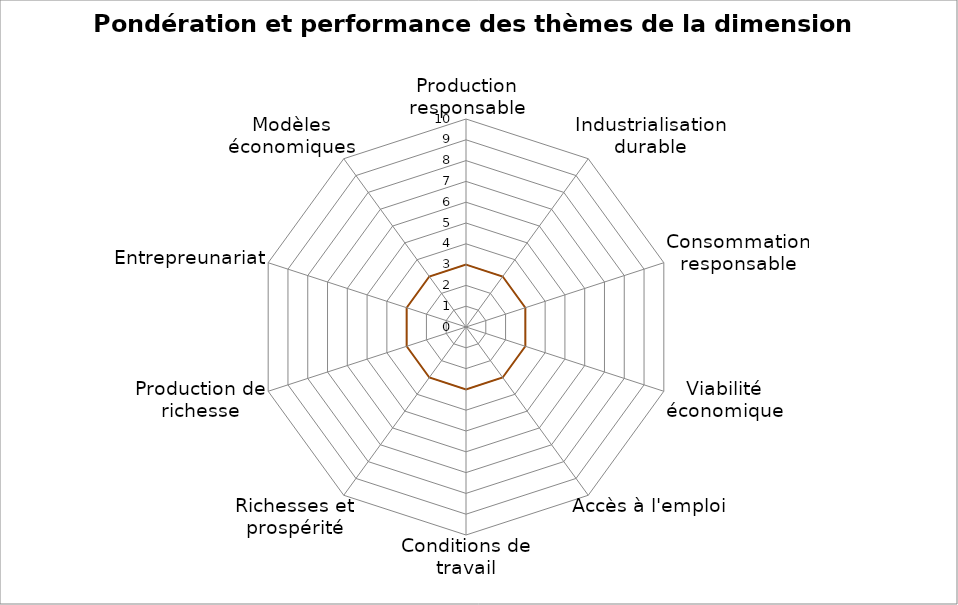
| Category | Performance | Pondération | Series 2 |
|---|---|---|---|
| Production responsable | 0 | 0 | 3 |
| Industrialisation durable | 0 | 0 | 3 |
| Consommation responsable | 0 | 0 | 3 |
| Viabilité économique | 0 | 0 | 3 |
| Accès à l'emploi | 0 | 0 | 3 |
| Conditions de travail | 0 | 0 | 3 |
| Richesses et prospérité | 0 | 0 | 3 |
| Production de richesse | 0 | 0 | 3 |
| Entrepreunariat | 0 | 0 | 3 |
| Modèles économiques | 0 | 0 | 3 |